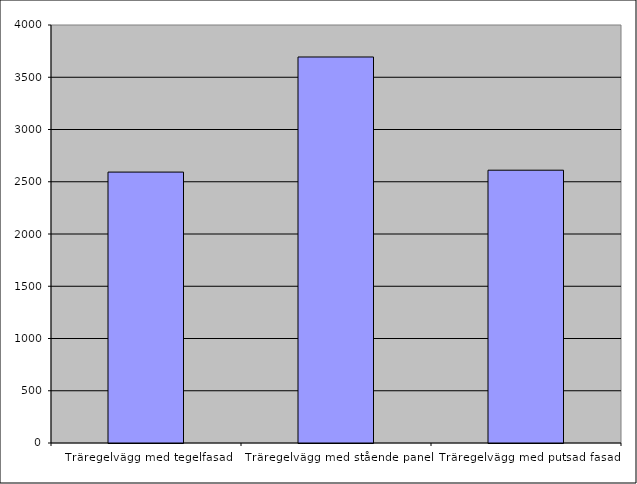
| Category | Series 0 |
|---|---|
| Träregelvägg med tegelfasad | 2592.542 |
| Träregelvägg med stående panel | 3693.796 |
| Träregelvägg med putsad fasad | 2610.542 |